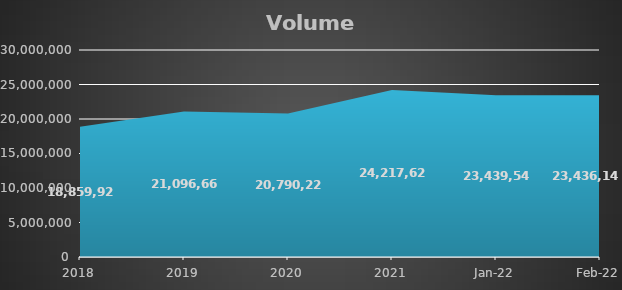
| Category | Metric Tons |
|---|---|
| 2018.0 | 18859924 |
| 2019.0 | 21096664 |
| 2020.0 | 20790224 |
| 2021.0 | 24217622 |
| 44592.0 | 23439541 |
| 44620.0 | 23436149 |